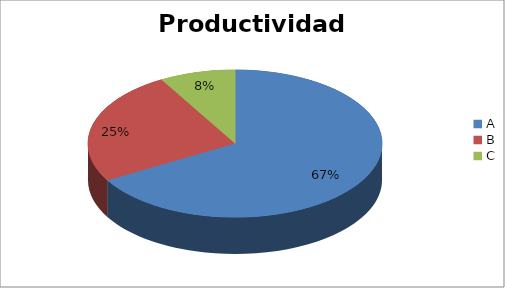
| Category | Series 0 |
|---|---|
| A | 66.667 |
| B | 25 |
| C | 8.333 |